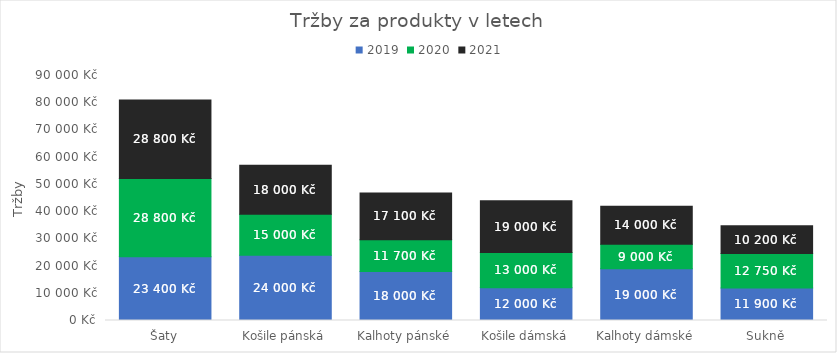
| Category | 2019 | 2020 | 2021 |
|---|---|---|---|
| Šaty | 23400 | 28800 | 28800 |
| Košile pánská | 24000 | 15000 | 18000 |
| Kalhoty pánské | 18000 | 11700 | 17100 |
| Košile dámská | 12000 | 13000 | 19000 |
| Kalhoty dámské | 19000 | 9000 | 14000 |
| Sukně | 11900 | 12750 | 10200 |